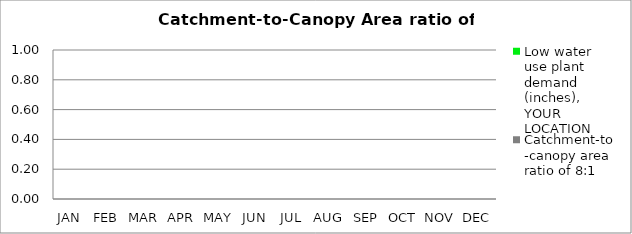
| Category | Low water use plant demand (inches), YOUR LOCATION | Catchment-to-canopy area ratio of 8:1  |
|---|---|---|
| JAN | 0 | 0 |
| FEB | 0 | 0 |
| MAR | 0 | 0 |
| APR | 0 | 0 |
| MAY | 0 | 0 |
| JUN | 0 | 0 |
| JUL | 0 | 0 |
| AUG | 0 | 0 |
| SEP | 0 | 0 |
| OCT | 0 | 0 |
| NOV | 0 | 0 |
| DEC | 0 | 0 |